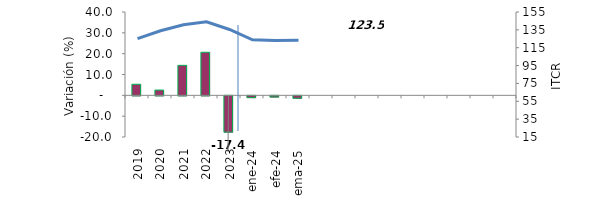
| Category | Series 0 |
|---|---|
| 2019 | 5.308 |
| 2020 | 2.527 |
| 2021 | 14.394 |
| 2022 | 20.67 |
| 2023 | -17.414 |
| ene-24 | -0.858 |
| efe-24 | -0.564 |
| ema-25 | -1.15 |